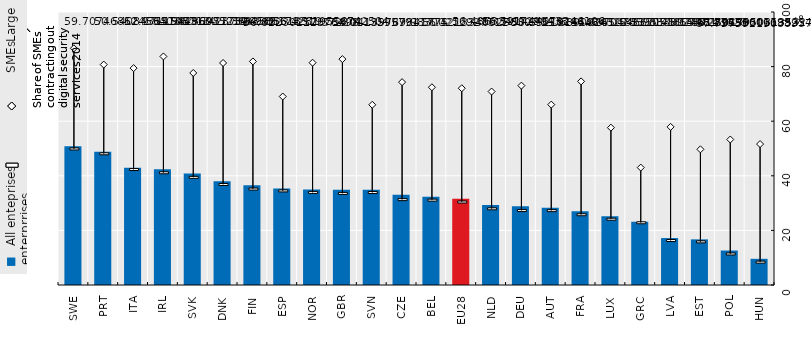
| Category | All enterprises |
|---|---|
| SWE | 50.825 |
| PRT | 48.822 |
| ITA | 42.908 |
| IRL | 42.427 |
| SVK | 40.867 |
| DNK | 38.009 |
| FIN | 36.57 |
| ESP | 35.347 |
| NOR | 35.01 |
| GBR | 34.925 |
| SVN | 34.911 |
| CZE | 33.016 |
| BEL | 32.313 |
| EU28 | 31.573 |
| NLD | 29.322 |
| DEU | 28.867 |
| AUT | 28.29 |
| FRA | 27.037 |
| LUX | 25.15 |
| GRC | 23.204 |
| LVA | 17.192 |
| EST | 16.713 |
| POL | 12.633 |
| HUN | 9.589 |